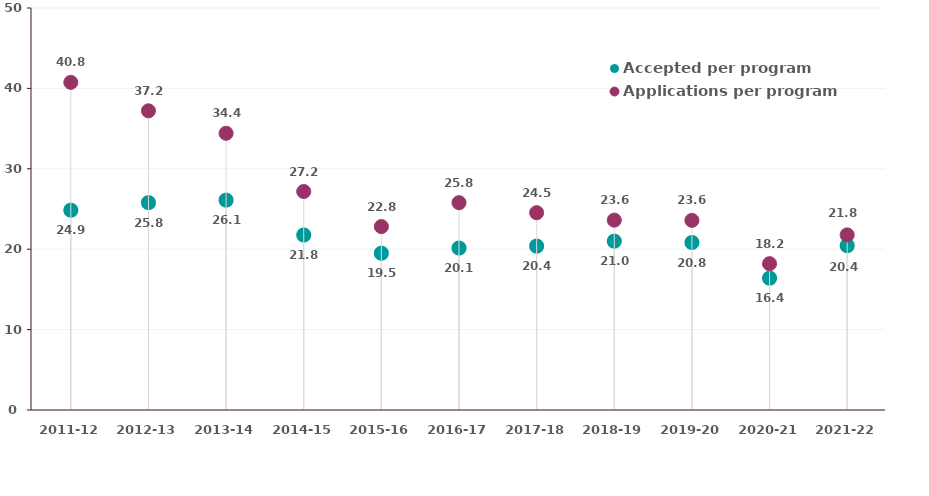
| Category | Accepted per program | Applications per program |
|---|---|---|
| 2011-12 | 24.85 | 40.75 |
| 2012-13 | 25.789 | 37.211 |
| 2013-14 | 26.105 | 34.421 |
| 2014-15 | 21.765 | 27.176 |
| 2015-16 | 19.5 | 22.812 |
| 2016-17 | 20.143 | 25.786 |
| 2017-18 | 20.385 | 24.538 |
| 2018-19 | 21 | 23.615 |
| 2019-20 | 20.833 | 23.583 |
| 2020-21 | 16.4 | 18.2 |
| 2021-22 | 20.444 | 21.778 |